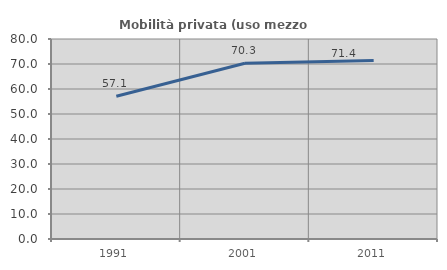
| Category | Mobilità privata (uso mezzo privato) |
|---|---|
| 1991.0 | 57.099 |
| 2001.0 | 70.3 |
| 2011.0 | 71.407 |